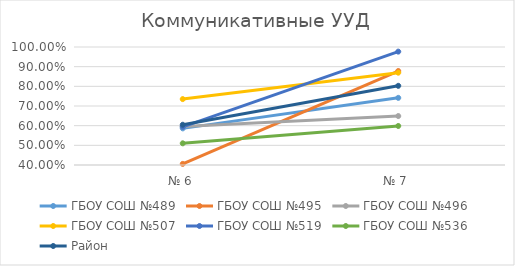
| Category | ГБОУ СОШ №489 | ГБОУ СОШ №495 | ГБОУ СОШ №496 | ГБОУ СОШ №507 | ГБОУ СОШ №519 | ГБОУ СОШ №536 | Район |
|---|---|---|---|---|---|---|---|
| № 6 | 0.586 | 0.406 | 0.596 | 0.735 | 0.594 | 0.51 | 0.605 |
| № 7 | 0.741 | 0.878 | 0.649 | 0.869 | 0.976 | 0.598 | 0.803 |